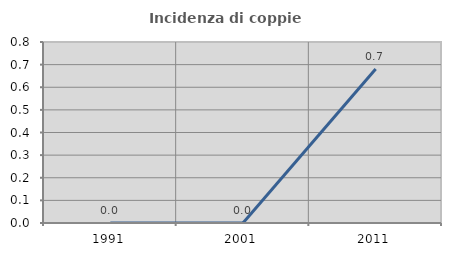
| Category | Incidenza di coppie miste |
|---|---|
| 1991.0 | 0 |
| 2001.0 | 0 |
| 2011.0 | 0.68 |